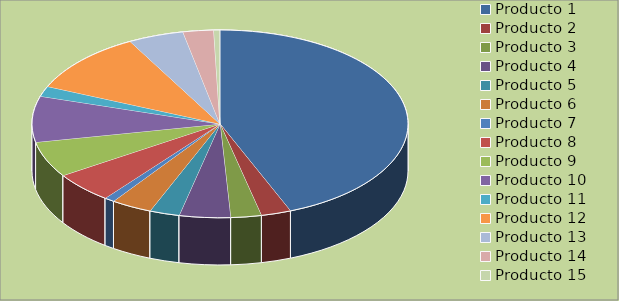
| Category | Series 0 |
|---|---|
| Producto 1 | 5000 |
| Producto 2 | 294 |
| Producto 3 | 300 |
| Producto 4 | 500 |
| Producto 5 | 294 |
| Producto 6 | 400 |
| Producto 7 | 100 |
| Producto 8 | 600 |
| Producto 9 | 700 |
| Producto 10 | 900 |
| Producto 11 | 200 |
| Producto 12 | 1200 |
| Producto 13 | 544 |
| Producto 14 | 300 |
| Producto 15 | 60 |